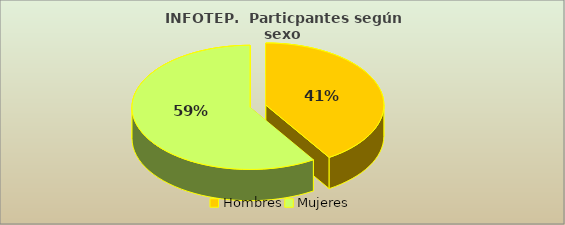
| Category | Series 0 |
|---|---|
| Hombres | 274860 |
| Mujeres | 395868 |